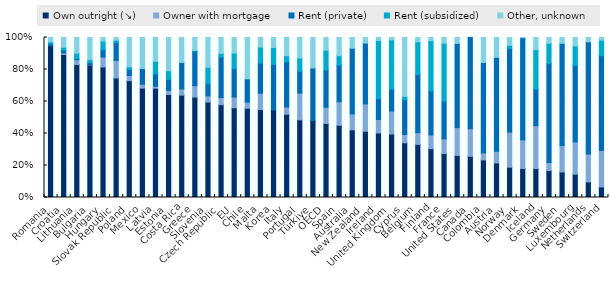
| Category | Own outright (↘) | Owner with mortgage | Rent (private) | Rent (subsidized) | Other, unknown |
|---|---|---|---|---|---|
| Romania | 0.948 | 0 | 0.013 | 0.012 | 0.027 |
| Croatia | 0.894 | 0.01 | 0.017 | 0.019 | 0.061 |
| Lithuania | 0.831 | 0.03 | 0.007 | 0.034 | 0.098 |
| Bulgaria | 0.829 | 0.002 | 0.013 | 0.019 | 0.138 |
| Hungary | 0.816 | 0.062 | 0.046 | 0.054 | 0.022 |
| Slovak Republic | 0.747 | 0.11 | 0.111 | 0.016 | 0.016 |
| Poland | 0.73 | 0.032 | 0.039 | 0.016 | 0.183 |
| Mexico | 0.684 | 0.024 | 0.099 | 0 | 0.193 |
| Latvia | 0.683 | 0.011 | 0.078 | 0.079 | 0.148 |
| Estonia | 0.644 | 0.026 | 0.068 | 0.054 | 0.208 |
| Costa Rica | 0.64 | 0.038 | 0.166 | 0 | 0.156 |
| Greece | 0.627 | 0.072 | 0.217 | 0.003 | 0.081 |
| Slovenia | 0.597 | 0.038 | 0.077 | 0.103 | 0.186 |
| Czech Republic | 0.58 | 0.045 | 0.252 | 0.023 | 0.1 |
| EU | 0.561 | 0.067 | 0.178 | 0.097 | 0.097 |
| Chile | 0.558 | 0.039 | 0.146 | 0 | 0.258 |
| Malta | 0.55 | 0.102 | 0.19 | 0.098 | 0.06 |
| Korea | 0.546 | 0 | 0.286 | 0.105 | 0.062 |
| Italy | 0.521 | 0.045 | 0.282 | 0.038 | 0.114 |
| Portugal | 0.485 | 0.167 | 0.137 | 0.082 | 0.128 |
| Türkiye | 0.481 | 0 | 0.329 | 0 | 0.191 |
| OECD | 0.462 | 0.101 | 0.233 | 0.124 | 0.079 |
| Spain | 0.451 | 0.147 | 0.23 | 0.058 | 0.114 |
| Australia | 0.423 | 0.1 | 0.41 | 0 | 0.067 |
| New Zealand | 0.414 | 0.171 | 0.38 | 0 | 0.035 |
| Ireland | 0.404 | 0.084 | 0.13 | 0.363 | 0.019 |
| United Kingdom | 0.397 | 0.143 | 0.137 | 0.307 | 0.015 |
| Cyprus | 0.342 | 0.052 | 0.217 | 0.021 | 0.368 |
| Belgium | 0.332 | 0.074 | 0.364 | 0.204 | 0.027 |
| Finland | 0.305 | 0.086 | 0.274 | 0.315 | 0.02 |
| France | 0.275 | 0.091 | 0.235 | 0.363 | 0.036 |
| United States | 0.262 | 0.174 | 0.526 | 0 | 0.037 |
| Canada | 0.258 | 0.172 | 0.57 | 0 | 0 |
| Colombia | 0.235 | 0.043 | 0.565 | 0 | 0.156 |
| Austria | 0.216 | 0.073 | 0.588 | 0 | 0.124 |
| Norway | 0.19 | 0.219 | 0.522 | 0.02 | 0.049 |
| Denmark | 0.181 | 0.179 | 0.638 | 0 | 0.001 |
| Iceland | 0.181 | 0.268 | 0.229 | 0.246 | 0.076 |
| Germany | 0.168 | 0.051 | 0.618 | 0.127 | 0.036 |
| Sweden | 0.16 | 0.165 | 0.639 | 0 | 0.036 |
| Luxembourg | 0.146 | 0.201 | 0.479 | 0.122 | 0.052 |
| Netherlands | 0.098 | 0.174 | 0.702 | 0 | 0.027 |
| Switzerland | 0.066 | 0.228 | 0.592 | 0.097 | 0.016 |